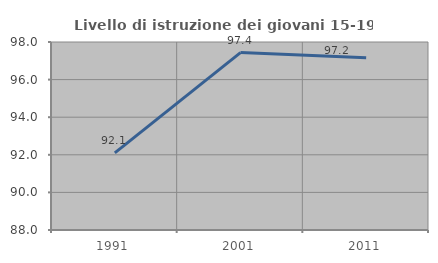
| Category | Livello di istruzione dei giovani 15-19 anni |
|---|---|
| 1991.0 | 92.105 |
| 2001.0 | 97.436 |
| 2011.0 | 97.159 |